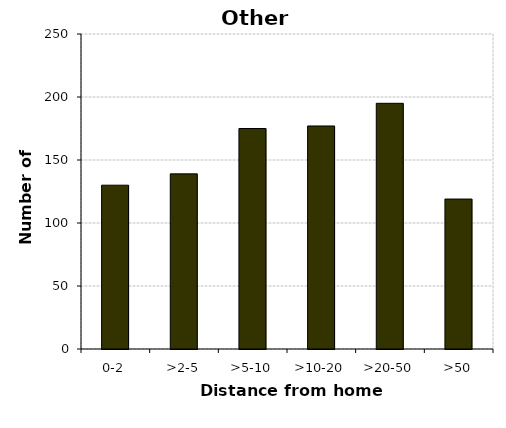
| Category | Other vehicles |
|---|---|
| 0-2 | 130 |
| >2-5 | 139 |
| >5-10 | 175 |
| >10-20 | 177 |
| >20-50 | 195 |
| >50 | 119 |